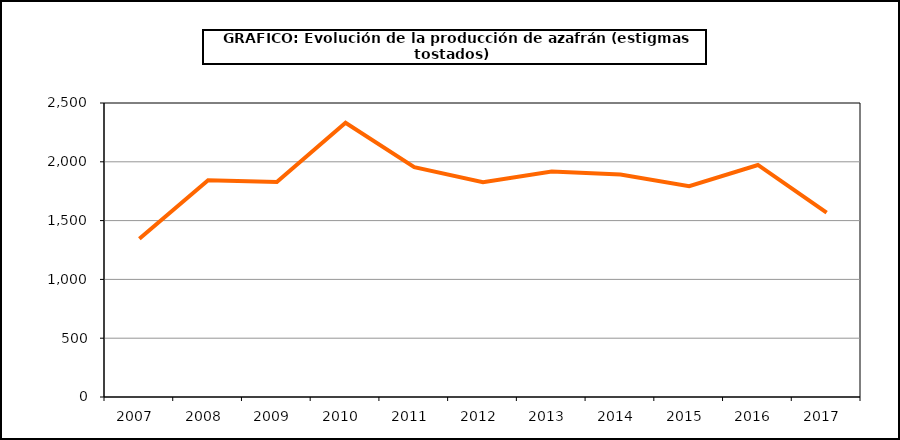
| Category | Producción |
|---|---|
| 2007.0 | 1345 |
| 2008.0 | 1843 |
| 2009.0 | 1829 |
| 2010.0 | 2332 |
| 2011.0 | 1954 |
| 2012.0 | 1827 |
| 2013.0 | 1918 |
| 2014.0 | 1892 |
| 2015.0 | 1793 |
| 2016.0 | 1973 |
| 2017.0 | 1567 |